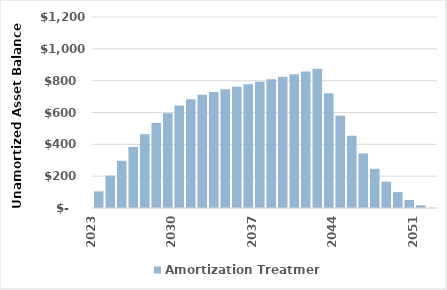
| Category | Amortization Treatment |
|---|---|
| 2023.0 | 104.561 |
| 2024.0 | 203.489 |
| 2025.0 | 296.535 |
| 2026.0 | 383.438 |
| 2027.0 | 463.924 |
| 2028.0 | 534.387 |
| 2029.0 | 594.624 |
| 2030.0 | 644.433 |
| 2031.0 | 683.605 |
| 2032.0 | 711.926 |
| 2033.0 | 729.18 |
| 2034.0 | 745.602 |
| 2035.0 | 761.448 |
| 2036.0 | 776.993 |
| 2037.0 | 792.533 |
| 2038.0 | 808.383 |
| 2039.0 | 824.551 |
| 2040.0 | 841.042 |
| 2041.0 | 857.863 |
| 2042.0 | 875.02 |
| 2043.0 | 720.512 |
| 2044.0 | 580.115 |
| 2045.0 | 454.11 |
| 2046.0 | 342.786 |
| 2047.0 | 246.437 |
| 2048.0 | 165.362 |
| 2049.0 | 99.865 |
| 2050.0 | 50.26 |
| 2051.0 | 16.864 |
| 2052.0 | 0 |